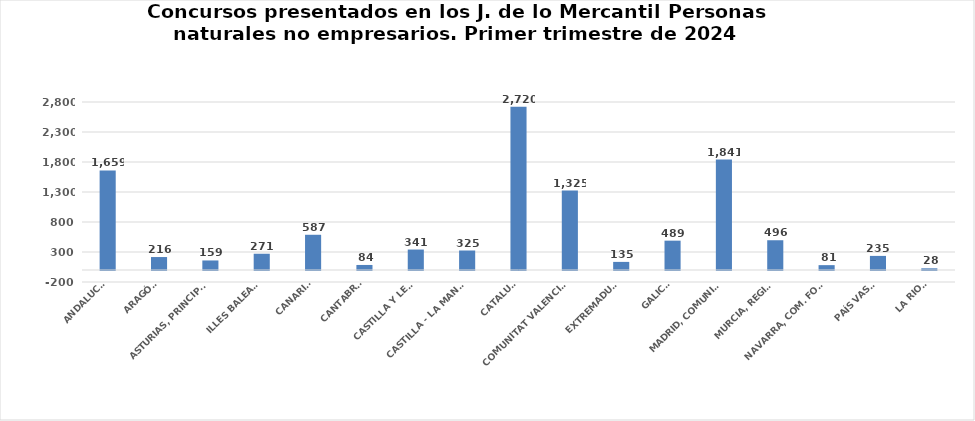
| Category | Series 0 |
|---|---|
| ANDALUCÍA | 1659 |
| ARAGÓN | 216 |
| ASTURIAS, PRINCIPADO | 159 |
| ILLES BALEARS | 271 |
| CANARIAS | 587 |
| CANTABRIA | 84 |
| CASTILLA Y LEÓN | 341 |
| CASTILLA - LA MANCHA | 325 |
| CATALUÑA | 2720 |
| COMUNITAT VALENCIANA | 1325 |
| EXTREMADURA | 135 |
| GALICIA | 489 |
| MADRID, COMUNIDAD | 1841 |
| MURCIA, REGIÓN | 496 |
| NAVARRA, COM. FORAL | 81 |
| PAÍS VASCO | 235 |
| LA RIOJA | 28 |